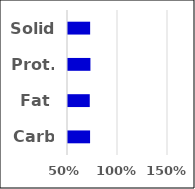
| Category | Value |
|---|---|
| Carb | 0.721 |
| Fat | 0.718 |
| Prot. | 0.724 |
| Solid | 0.721 |